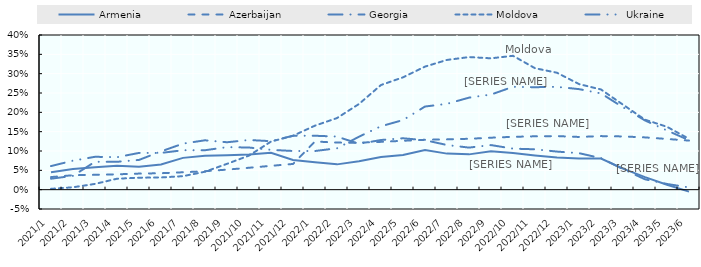
| Category | Armenia | Azerbaijan | Georgia | Moldova | Ukraine |
|---|---|---|---|---|---|
| 2021/1 | 0.045 | 0.033 | 0.028 | 0.002 | 0.061 |
| 2021/2 | 0.053 | 0.037 | 0.036 | 0.006 | 0.075 |
| 2021/3 | 0.058 | 0.039 | 0.072 | 0.015 | 0.085 |
| 2021/4 | 0.062 | 0.04 | 0.072 | 0.028 | 0.084 |
| 2021/5 | 0.059 | 0.042 | 0.077 | 0.031 | 0.095 |
| 2021/6 | 0.065 | 0.043 | 0.099 | 0.032 | 0.095 |
| 2021/7 | 0.082 | 0.045 | 0.119 | 0.035 | 0.102 |
| 2021/8 | 0.088 | 0.048 | 0.128 | 0.046 | 0.102 |
| 2021/9 | 0.089 | 0.052 | 0.123 | 0.067 | 0.11 |
| 2021/10 | 0.091 | 0.057 | 0.128 | 0.088 | 0.109 |
| 2021/11 | 0.096 | 0.062 | 0.125 | 0.124 | 0.103 |
| 2021/12 | 0.077 | 0.067 | 0.139 | 0.139 | 0.1 |
| 2022/1 | 0.071 | 0.125 | 0.139 | 0.166 | 0.1 |
| 2022/2 | 0.065 | 0.122 | 0.137 | 0.185 | 0.107 |
| 2022/3 | 0.074 | 0.122 | 0.118 | 0.222 | 0.137 |
| 2022/4 | 0.084 | 0.124 | 0.128 | 0.271 | 0.164 |
| 2022/5 | 0.09 | 0.126 | 0.133 | 0.291 | 0.18 |
| 2022/6 | 0.103 | 0.129 | 0.128 | 0.318 | 0.215 |
| 2022/7 | 0.093 | 0.13 | 0.115 | 0.336 | 0.222 |
| 2022/8 | 0.091 | 0.132 | 0.109 | 0.343 | 0.238 |
| 2022/9 | 0.099 | 0.134 | 0.115 | 0.34 | 0.246 |
| 2022/10 | 0.095 | 0.137 | 0.106 | 0.346 | 0.266 |
| 2022/11 | 0.088 | 0.138 | 0.104 | 0.314 | 0.265 |
| 2022/12 | 0.083 | 0.139 | 0.098 | 0.302 | 0.266 |
| 2023/1 | 0.081 | 0.136 | 0.094 | 0.273 | 0.26 |
| 2023/2 | 0.081 | 0.139 | 0.081 | 0.259 | 0.249 |
| 2023/3 | 0.054 | 0.138 | 0.053 | 0.22 | 0.213 |
| 2023/4 | 0.032 | 0.135 | 0.027 | 0.181 | 0.179 |
| 2023/5 | 0.013 | 0.131 | 0.015 | 0.163 | 0.153 |
| 2023/6 | -0.005 | 0.127 | 0.006 | 0.132 | 0.128 |